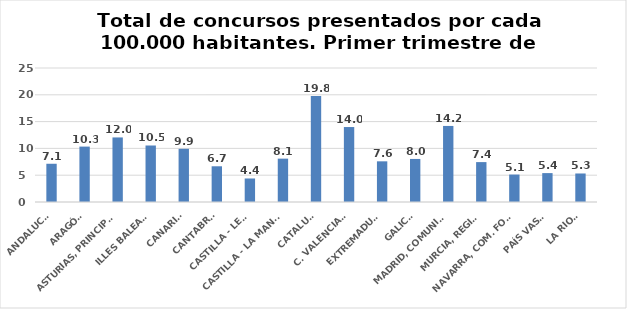
| Category | Series 0 |
|---|---|
| ANDALUCÍA | 7.135 |
| ARAGÓN | 10.337 |
| ASTURIAS, PRINCIPADO | 12.046 |
| ILLES BALEARS | 10.542 |
| CANARIAS | 9.925 |
| CANTABRIA | 6.664 |
| CASTILLA - LEÓN | 4.388 |
| CASTILLA - LA MANCHA | 8.089 |
| CATALUÑA | 19.76 |
| C. VALENCIANA | 13.986 |
| EXTREMADURA | 7.588 |
| GALICIA | 8.032 |
| MADRID, COMUNIDAD | 14.189 |
| MURCIA, REGIÓN | 7.444 |
| NAVARRA, COM. FORAL | 5.123 |
| PAÍS VASCO | 5.391 |
| LA RIOJA | 5.321 |